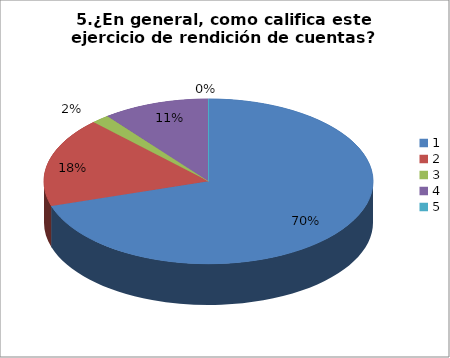
| Category | Series 0 |
|---|---|
| 0 | 40 |
| 1 | 10 |
| 2 | 1 |
| 3 | 6 |
| 4 | 0 |